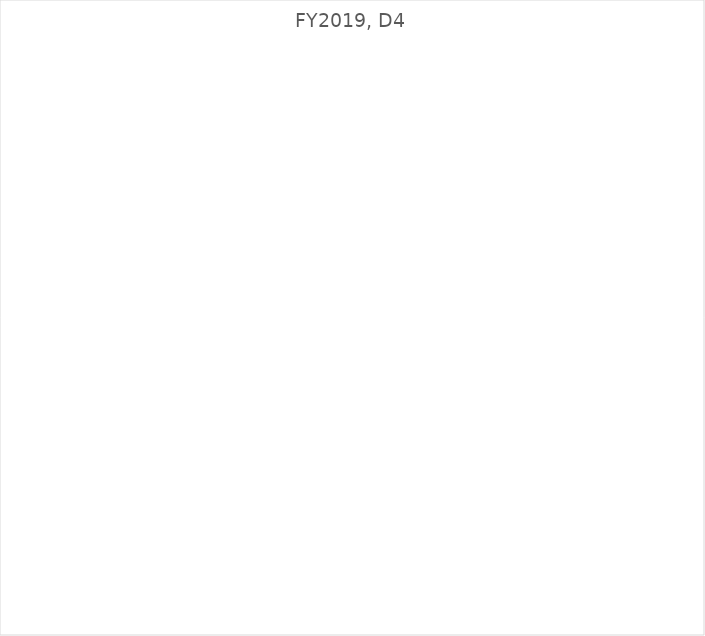
| Category | Series 0 |
|---|---|
| Cell, Wireless | 0 |
| Copies | 0 |
| Facility Use | 0 |
| Lei and Food | 0 |
| Office Supplies | 0 |
| Postage | 0 |
| Printing, Photos, Certificates, Certificate supplies | 0 |
| Subscription | 0 |
| Travel and Conferences | 0 |
| Vehicle Allowance, parking | 0 |
| Miscellaneous | 0 |